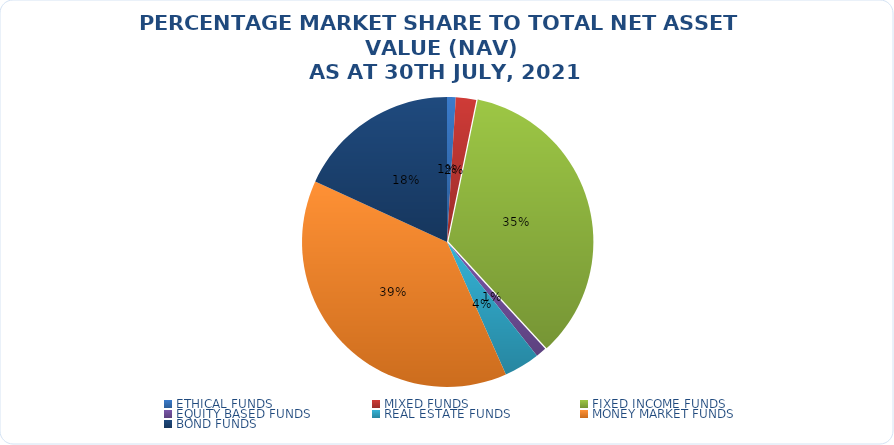
| Category | NET ASSET VALUE |
|---|---|
| ETHICAL FUNDS | 12327116067.224 |
| MIXED FUNDS | 28926579836.08 |
| FIXED INCOME FUNDS | 444470273122.781 |
| EQUITY BASED FUNDS | 15134422058.42 |
| REAL ESTATE FUNDS | 50866881335.64 |
| MONEY MARKET FUNDS | 490122576435.89 |
| BOND FUNDS | 231015858735.958 |